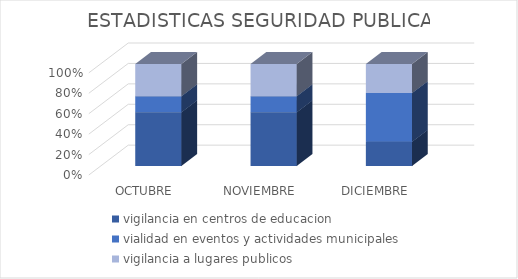
| Category | vigilancia en centros de educacion | vialidad en eventos y actividades municipales | vigilancia a lugares publicos |
|---|---|---|---|
| OCTUBRE | 50 | 15 | 30 |
| NOVIEMBRE | 50 | 15 | 30 |
| DICIEMBRE | 25 | 50 | 30 |